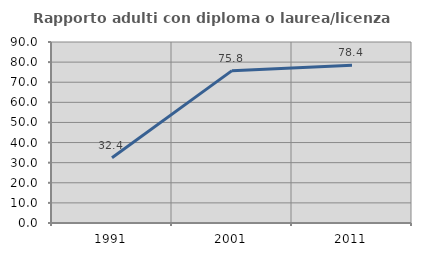
| Category | Rapporto adulti con diploma o laurea/licenza media  |
|---|---|
| 1991.0 | 32.432 |
| 2001.0 | 75.758 |
| 2011.0 | 78.378 |